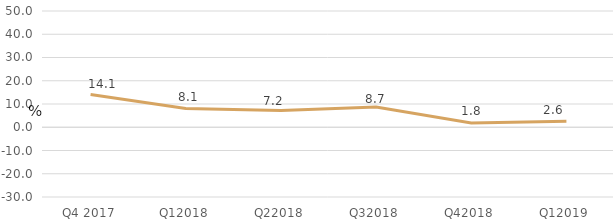
| Category | Series 0 |
|---|---|
| Q4 2017 | 14.095 |
| Q12018 | 8.098 |
| Q22018 | 7.179 |
| Q32018 | 8.668 |
| Q42018 | 1.85 |
| Q12019 | 2.587 |